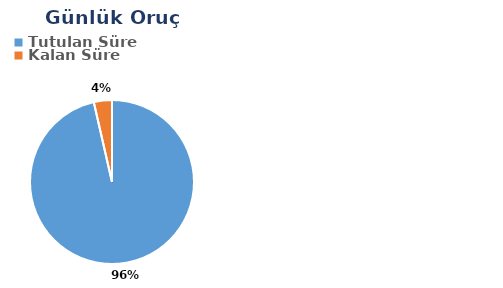
| Category | Günlük |
|---|---|
| Tutulan Süre | 0.573 |
| Kalan Süre | 0.021 |